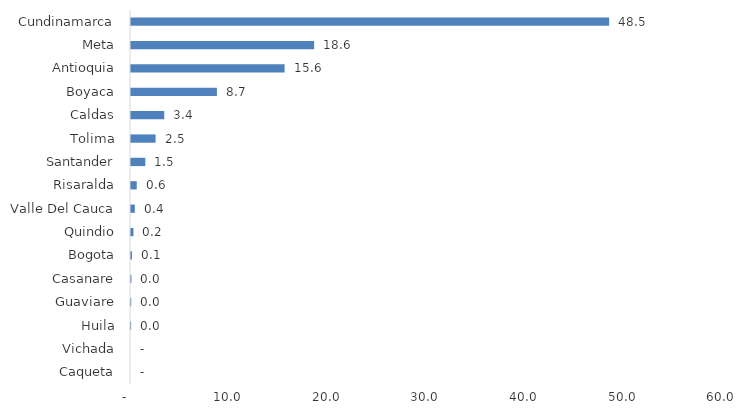
| Category | Series 0 |
|---|---|
| Caqueta | 0 |
| Vichada | 0 |
| Huila | 0.015 |
| Guaviare | 0.025 |
| Casanare | 0.042 |
| Bogota | 0.094 |
| Quindio | 0.248 |
| Valle Del Cauca | 0.388 |
| Risaralda | 0.582 |
| Santander | 1.451 |
| Tolima | 2.492 |
| Caldas | 3.37 |
| Boyaca | 8.705 |
| Antioquia | 15.566 |
| Meta | 18.562 |
| Cundinamarca | 48.461 |